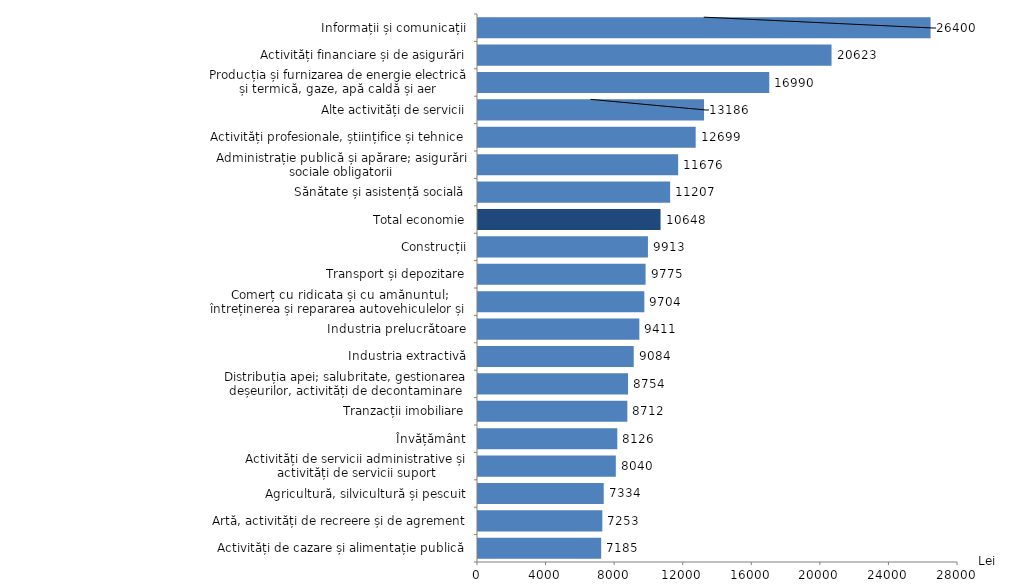
| Category | Lei |
|---|---|
| Activități de cazare și alimentație publică | 7184.6 |
| Artă, activități de recreere și de agrement | 7252.7 |
| Agricultură, silvicultură și pescuit | 7333.6 |
| Activități de servicii administrative și activități de servicii suport | 8039.5 |
| Învățământ | 8126.2 |
| Tranzacții imobiliare | 8712 |
| Distribuția apei; salubritate, gestionarea deșeurilor, activități de decontaminare | 8753.5 |
| Industria extractivă | 9083.9 |
| Industria prelucrătoare | 9411.3 |
| Comerț cu ridicata și cu amănuntul; întreținerea și repararea autovehiculelor și a motocicletelor | 9703.7 |
| Transport și depozitare | 9775.4 |
| Construcții | 9913.1 |
| Total economie | 10648.1 |
| Sănătate și asistență socială | 11207.1 |
| Administrație publică și apărare; asigurări sociale obligatorii | 11675.9 |
| Activități profesionale, științifice și tehnice | 12698.6 |
| Alte activități de servicii | 13186.2 |
| Producția și furnizarea de energie electrică și termică, gaze, apă caldă și aer condiționat | 16990.1 |
| Activități financiare și de asigurări | 20623.4 |
| Informații și comunicații | 26399.6 |